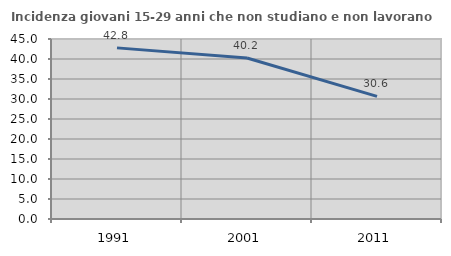
| Category | Incidenza giovani 15-29 anni che non studiano e non lavorano  |
|---|---|
| 1991.0 | 42.781 |
| 2001.0 | 40.247 |
| 2011.0 | 30.647 |